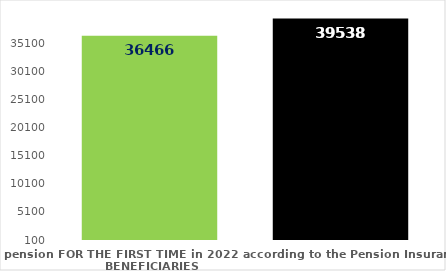
| Category | broj korisnika |
|---|---|
| Pension beneficiaries entitled to pension FOR THE FIRST TIME in 2022 according to the Pension Insurance Act  - NEW BENEFICIARIES | 36466 |
| Pension beneficiaries whose pension entitlement ceased in 2022  -  death caused,   
and who were retired according to the Pension Insurance Act   | 39538 |